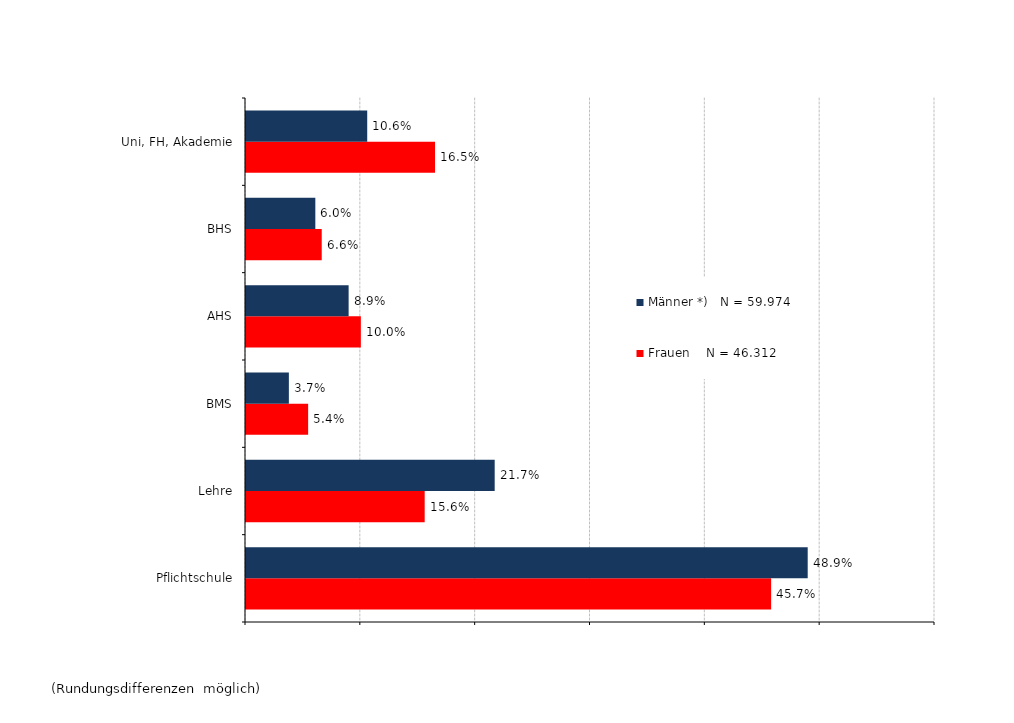
| Category | Frauen    N = 46.312 | Männer *)   N = 59.974 |
|---|---|---|
| Pflichtschule | 0.457 | 0.489 |
| Lehre | 0.156 | 0.217 |
| BMS | 0.054 | 0.037 |
| AHS | 0.1 | 0.089 |
| BHS | 0.066 | 0.06 |
| Uni, FH, Akademie | 0.165 | 0.106 |